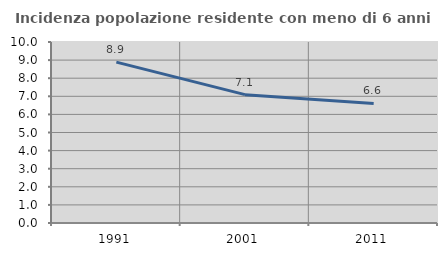
| Category | Incidenza popolazione residente con meno di 6 anni |
|---|---|
| 1991.0 | 8.888 |
| 2001.0 | 7.091 |
| 2011.0 | 6.607 |